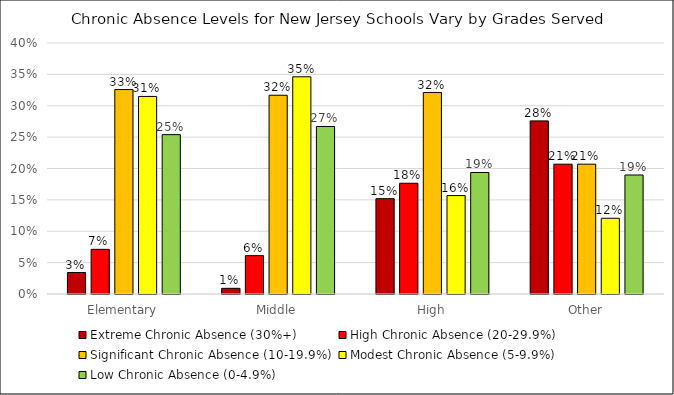
| Category | Extreme Chronic Absence (30%+) | High Chronic Absence (20-29.9%) | Significant Chronic Absence (10-19.9%) | Modest Chronic Absence (5-9.9%) | Low Chronic Absence (0-4.9%) |
|---|---|---|---|---|---|
| Elementary | 0.034 | 0.071 | 0.326 | 0.315 | 0.254 |
| Middle | 0.009 | 0.061 | 0.317 | 0.346 | 0.267 |
| High | 0.152 | 0.176 | 0.321 | 0.157 | 0.194 |
| Other | 0.276 | 0.207 | 0.207 | 0.121 | 0.19 |